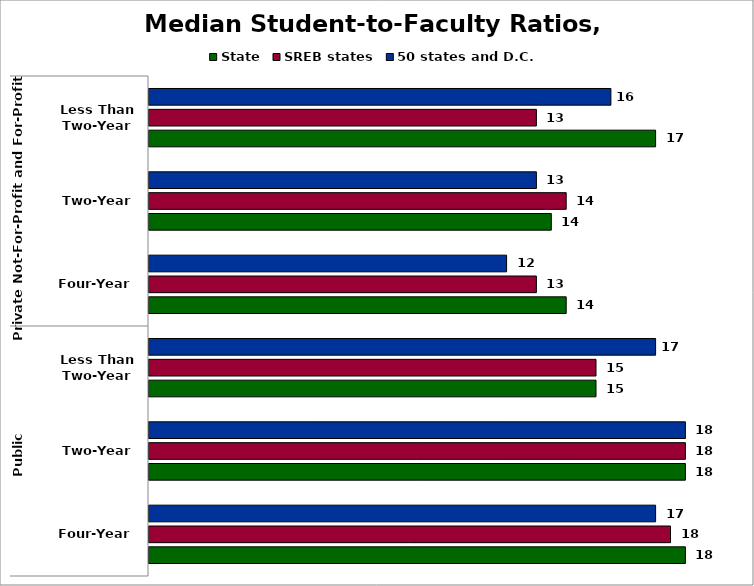
| Category | State | SREB states | 50 states and D.C. |
|---|---|---|---|
| 0 | 18 | 17.5 | 17 |
| 1 | 18 | 18 | 18 |
| 2 | 15 | 15 | 17 |
| 3 | 14 | 13 | 12 |
| 4 | 13.5 | 14 | 13 |
| 5 | 17 | 13 | 15.5 |